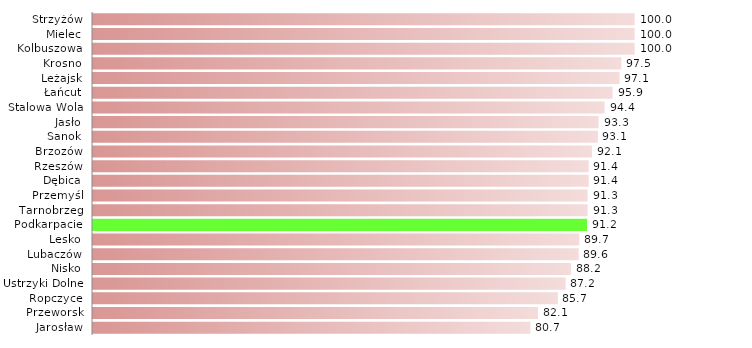
| Category | Bon na zasiedlenie |
|---|---|
| Jarosław | 80.702 |
| Przeworsk | 82.143 |
| Ropczyce | 85.714 |
| Ustrzyki Dolne | 87.179 |
| Nisko | 88.235 |
| Lubaczów | 89.583 |
| Lesko | 89.744 |
| Podkarpacie | 91.209 |
| Tarnobrzeg | 91.304 |
| Przemyśl | 91.304 |
| Dębica | 91.429 |
| Rzeszów | 91.429 |
| Brzozów | 92.105 |
| Sanok | 93.103 |
| Jasło | 93.333 |
| Stalowa Wola | 94.444 |
| Łańcut | 95.918 |
| Leżajsk | 97.143 |
| Krosno | 97.5 |
| Kolbuszowa | 100 |
| Mielec | 100 |
| Strzyżów | 100 |